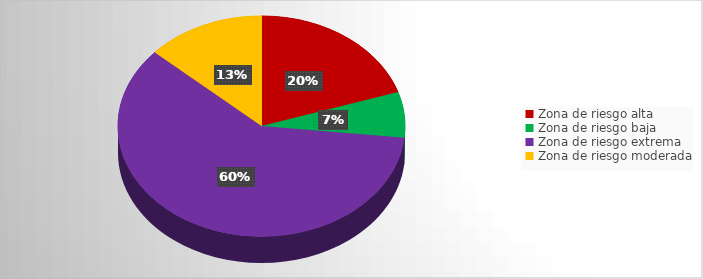
| Category | Total |
|---|---|
| Zona de riesgo alta | 3 |
| Zona de riesgo baja | 1 |
| Zona de riesgo extrema | 9 |
| Zona de riesgo moderada | 2 |